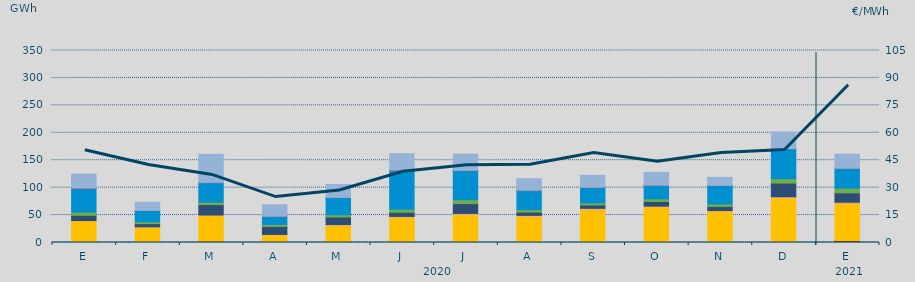
| Category | Carbón | Ciclo Combinado | Cogeneración | Consumo Bombeo | Eólica | Hidráulica | Nuclear | Otras Renovables | Solar fotovoltaica | Solar térmica | Turbinación bombeo |
|---|---|---|---|---|---|---|---|---|---|---|---|
| E | 1376.4 | 38547.2 | 103.6 | 9542.6 | 5736.2 | 43797.8 | 0.3 | 0 | 1.3 | 1 | 25589.5 |
| F | 1350.5 | 27202.4 | 33.6 | 5812.5 | 3281.1 | 20532.5 | 140 | 103.7 | 7.4 | 0 | 14830 |
| M | 2245.9 | 47824.7 | 73.5 | 18946.1 | 4359.7 | 35788.8 | 0 | 674.6 | 8.2 | 0 | 50742.6 |
| A | 0 | 14386.3 | 255.3 | 14671.4 | 3599.9 | 14970.4 | 0 | 474.6 | 1.7 | 0 | 20437.2 |
| M | 0 | 31710.8 | 991.1 | 13782.9 | 4057.5 | 31461.1 | 16.4 | 257 | 5.9 | 0 | 23468.1 |
| J | 82.3 | 46358.8 | 1092.1 | 7553.9 | 5342.6 | 71363.3 | 488.9 | 0.6 | 15.1 | 0 | 29619.5 |
| J | 41 | 51366.4 | 1567 | 17926.2 | 6971.2 | 53578.6 | 144 | 24.9 | 30.8 | 0 | 29400.3 |
| A | 6.7 | 48088.1 | 1369.2 | 5986.6 | 4572.9 | 35455.6 | 0 | 107.3 | 13.8 | 0 | 20673.5 |
| S | 54.7 | 60777.7 | 1507.9 | 6085.9 | 3725.9 | 28681.9 | 75 | 8 | 25.7 | 0 | 21527.4 |
| O | 27.3 | 65427.4 | 840.9 | 8534.6 | 4755.7 | 24804.7 | 0 | 0 | 8 | 2.5 | 23457.4 |
| N | 575.3 | 57009.7 | 618 | 7516.8 | 4494.6 | 33922.4 | 5.6 | 0.3 | 7.2 | 0 | 14589.5 |
| D | 160.3 | 81818 | 1565.6 | 24860.4 | 7908.5 | 54934.2 | 0 | 0 | 16.2 | 0 | 29926.3 |
| E | 3748.2 | 68568.9 | 1069.7 | 17152.7 | 8410.7 | 36501.6 | 0 | 0 | 17.1 | 0 | 25434.1 |